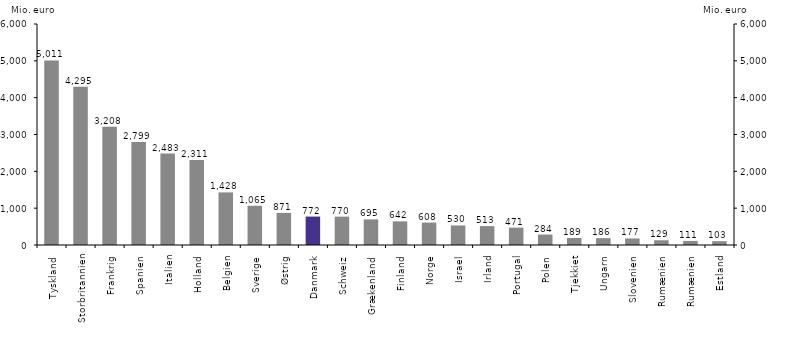
| Category | Mio. Euro |
|---|---|
| Tyskland | 5011.44 |
| Storbritannien | 4294.556 |
| Frankrig | 3208.278 |
| Spanien | 2799.297 |
| Italien | 2483.462 |
| Holland | 2310.95 |
| Belgien | 1427.949 |
| Sverige | 1064.805 |
| Østrig | 871.431 |
| Danmark | 771.903 |
| Schweiz | 769.876 |
| Grækenland | 695.069 |
| Finland | 642.165 |
| Norge | 607.881 |
| Israel | 530.302 |
| Irland | 513.08 |
| Portugal | 470.822 |
| Polen | 283.646 |
| Tjekkiet | 189.212 |
| Ungarn | 185.993 |
| Slovenien | 177.054 |
| Rumænien | 128.604 |
| Rumænien | 110.617 |
| Estland | 103.426 |